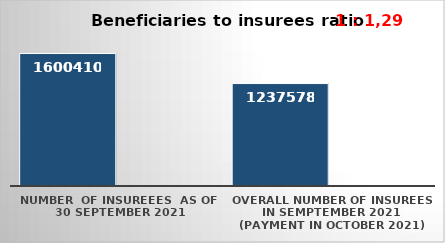
| Category | Series 0 | Series 1 |
|---|---|---|
| NUMBER  of insureees  as of  30 September 2021 | 1600410 |  |
| OVERALL number of insurees in Semptember 2021 (payment in October 2021) | 1237578 |  |